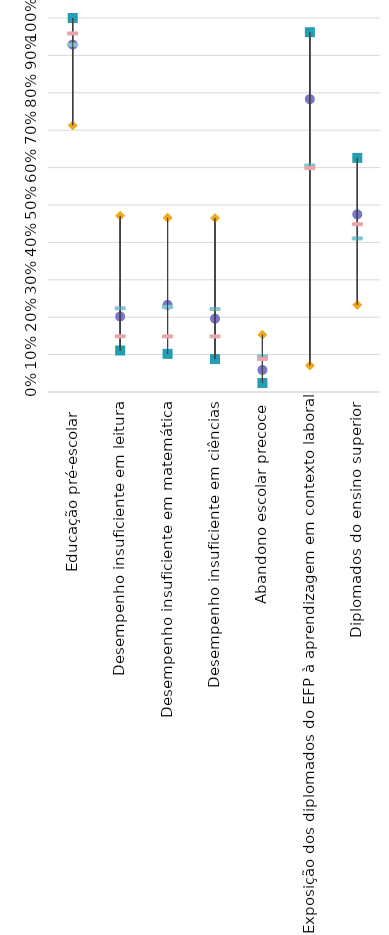
| Category | Portugal | Strongest performer | Weakest performer | EU average | EU target |
|---|---|---|---|---|---|
| Educação pré-escolar  | 0.929 | 1 | 0.713 | 0.93 | 0.96 |
| Desempenho insuficiente em leitura | 0.202 | 0.111 | 0.471 | 0.225 | 0.15 |
| Desempenho insuficiente em matemática | 0.233 | 0.102 | 0.466 | 0.229 | 0.15 |
| Desempenho insuficiente em ciências | 0.196 | 0.088 | 0.465 | 0.223 | 0.15 |
| Abandono escolar precoce | 0.059 | 0.024 | 0.153 | 0.097 | 0.09 |
| Exposição dos diplomados do EFP à aprendizagem em contexto laboral | 0.783 | 0.962 | 0.071 | 0.607 | 0.6 |
| Diplomados do ensino superior | 0.475 | 0.626 | 0.233 | 0.412 | 0.45 |